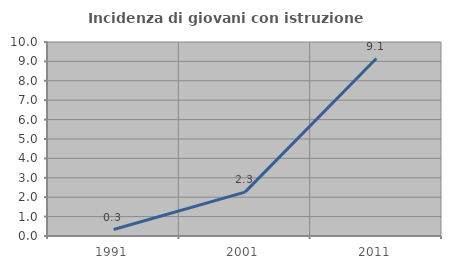
| Category | Incidenza di giovani con istruzione universitaria |
|---|---|
| 1991.0 | 0.334 |
| 2001.0 | 2.262 |
| 2011.0 | 9.149 |